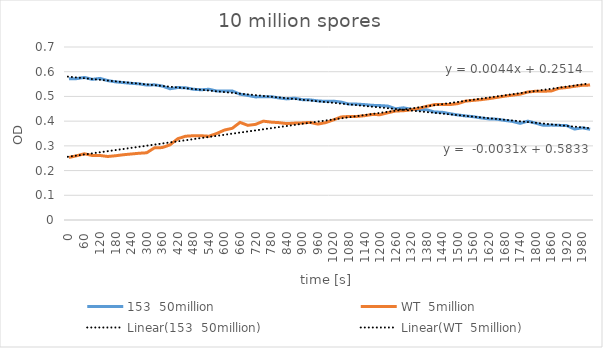
| Category | 153  50million | WT  5million |
|---|---|---|
| 0.0 | 0.571 | 0.253 |
| 30.0 | 0.572 | 0.26 |
| 60.0 | 0.577 | 0.268 |
| 90.0 | 0.569 | 0.261 |
| 120.0 | 0.573 | 0.261 |
| 150.0 | 0.564 | 0.257 |
| 180.0 | 0.559 | 0.26 |
| 210.0 | 0.556 | 0.264 |
| 240.0 | 0.553 | 0.267 |
| 270.0 | 0.551 | 0.27 |
| 300.0 | 0.546 | 0.272 |
| 330.0 | 0.547 | 0.292 |
| 360.0 | 0.542 | 0.293 |
| 390.0 | 0.531 | 0.304 |
| 420.0 | 0.536 | 0.329 |
| 450.0 | 0.535 | 0.339 |
| 480.0 | 0.529 | 0.341 |
| 510.0 | 0.527 | 0.341 |
| 540.0 | 0.529 | 0.339 |
| 570.0 | 0.522 | 0.35 |
| 600.0 | 0.522 | 0.364 |
| 630.0 | 0.522 | 0.371 |
| 660.0 | 0.509 | 0.395 |
| 690.0 | 0.504 | 0.383 |
| 720.0 | 0.498 | 0.387 |
| 750.0 | 0.499 | 0.4 |
| 780.0 | 0.499 | 0.396 |
| 810.0 | 0.494 | 0.394 |
| 840.0 | 0.49 | 0.39 |
| 870.0 | 0.493 | 0.392 |
| 900.0 | 0.487 | 0.393 |
| 930.0 | 0.486 | 0.395 |
| 960.0 | 0.482 | 0.388 |
| 990.0 | 0.48 | 0.394 |
| 1020.0 | 0.481 | 0.405 |
| 1050.0 | 0.477 | 0.417 |
| 1080.0 | 0.469 | 0.419 |
| 1110.0 | 0.469 | 0.419 |
| 1140.0 | 0.467 | 0.422 |
| 1170.0 | 0.464 | 0.427 |
| 1200.0 | 0.463 | 0.426 |
| 1230.0 | 0.461 | 0.434 |
| 1260.0 | 0.45 | 0.441 |
| 1290.0 | 0.454 | 0.442 |
| 1320.0 | 0.448 | 0.446 |
| 1350.0 | 0.446 | 0.452 |
| 1380.0 | 0.446 | 0.46 |
| 1410.0 | 0.437 | 0.467 |
| 1440.0 | 0.436 | 0.467 |
| 1470.0 | 0.43 | 0.467 |
| 1500.0 | 0.425 | 0.471 |
| 1530.0 | 0.421 | 0.481 |
| 1560.0 | 0.418 | 0.484 |
| 1590.0 | 0.413 | 0.487 |
| 1620.0 | 0.409 | 0.491 |
| 1650.0 | 0.408 | 0.496 |
| 1680.0 | 0.403 | 0.501 |
| 1710.0 | 0.399 | 0.505 |
| 1740.0 | 0.391 | 0.509 |
| 1770.0 | 0.4 | 0.518 |
| 1800.0 | 0.392 | 0.521 |
| 1830.0 | 0.383 | 0.521 |
| 1860.0 | 0.384 | 0.522 |
| 1890.0 | 0.383 | 0.533 |
| 1920.0 | 0.382 | 0.536 |
| 1950.0 | 0.368 | 0.541 |
| 1980.0 | 0.373 | 0.545 |
| 2010.0 | 0.367 | 0.546 |